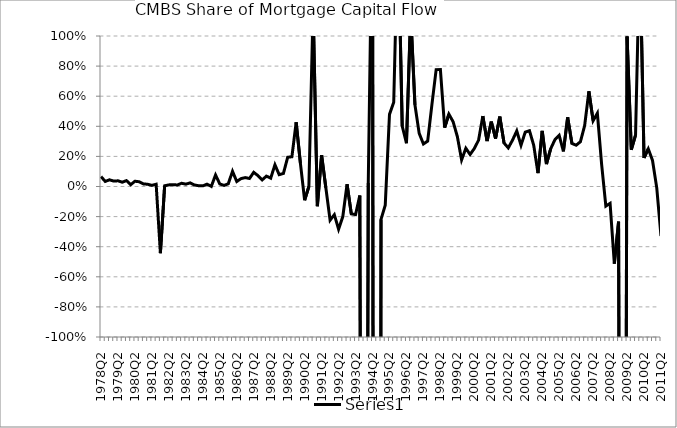
| Category | Series 0 |
|---|---|
| 1978Q2 | 0.066 |
| 1978Q3 | 0.034 |
| 1978Q4 | 0.045 |
| 1979Q1 | 0.036 |
| 1979Q2 | 0.038 |
| 1979Q3 | 0.028 |
| 1979Q4 | 0.039 |
| 1980Q1 | 0.012 |
| 1980Q2 | 0.035 |
| 1980Q3 | 0.032 |
| 1980Q4 | 0.017 |
| 1981Q1 | 0.015 |
| 1981Q2 | 0.008 |
| 1981Q3 | 0.015 |
| 1981Q4 | -0.443 |
| 1982Q1 | 0.005 |
| 1982Q2 | 0.011 |
| 1982Q3 | 0.012 |
| 1982Q4 | 0.01 |
| 1983Q1 | 0.022 |
| 1983Q2 | 0.015 |
| 1983Q3 | 0.024 |
| 1983Q4 | 0.01 |
| 1984Q1 | 0.005 |
| 1984Q2 | 0.004 |
| 1984Q3 | 0.016 |
| 1984Q4 | 0.001 |
| 1985Q1 | 0.076 |
| 1985Q2 | 0.017 |
| 1985Q3 | 0.007 |
| 1985Q4 | 0.018 |
| 1986Q1 | 0.101 |
| 1986Q2 | 0.033 |
| 1986Q3 | 0.052 |
| 1986Q4 | 0.059 |
| 1987Q1 | 0.053 |
| 1987Q2 | 0.094 |
| 1987Q3 | 0.072 |
| 1987Q4 | 0.044 |
| 1988Q1 | 0.069 |
| 1988Q2 | 0.055 |
| 1988Q3 | 0.144 |
| 1988Q4 | 0.079 |
| 1989Q1 | 0.087 |
| 1989Q2 | 0.194 |
| 1989Q3 | 0.198 |
| 1989Q4 | 0.427 |
| 1990Q1 | 0.155 |
| 1990Q2 | -0.091 |
| 1990Q3 | 0 |
| 1990Q4 | 1.188 |
| 1991Q1 | -0.131 |
| 1991Q2 | 0.208 |
| 1991Q3 | -0.008 |
| 1991Q4 | -0.224 |
| 1992Q1 | -0.187 |
| 1992Q2 | -0.284 |
| 1992Q3 | -0.2 |
| 1992Q4 | 0.015 |
| 1993Q1 | -0.182 |
| 1993Q2 | -0.187 |
| 1993Q3 | -0.06 |
| 1993Q4 | -9.414 |
| 1994Q1 | 0.024 |
| 1994Q2 | 1.984 |
| 1994Q3 | -24.911 |
| 1994Q4 | -0.219 |
| 1995Q1 | -0.125 |
| 1995Q2 | 0.479 |
| 1995Q3 | 0.559 |
| 1995Q4 | 1.724 |
| 1996Q1 | 0.401 |
| 1996Q2 | 0.288 |
| 1996Q3 | 1.153 |
| 1996Q4 | 0.543 |
| 1997Q1 | 0.353 |
| 1997Q2 | 0.282 |
| 1997Q3 | 0.302 |
| 1997Q4 | 0.544 |
| 1998Q1 | 0.777 |
| 1998Q2 | 0.777 |
| 1998Q3 | 0.391 |
| 1998Q4 | 0.481 |
| 1999Q1 | 0.43 |
| 1999Q2 | 0.331 |
| 1999Q3 | 0.177 |
| 1999Q4 | 0.254 |
| 2000Q1 | 0.213 |
| 2000Q2 | 0.253 |
| 2000Q3 | 0.308 |
| 2000Q4 | 0.468 |
| 2001Q1 | 0.302 |
| 2001Q2 | 0.431 |
| 2001Q3 | 0.319 |
| 2001Q4 | 0.465 |
| 2002Q1 | 0.289 |
| 2002Q2 | 0.256 |
| 2002Q3 | 0.308 |
| 2002Q4 | 0.369 |
| 2003Q1 | 0.274 |
| 2003Q2 | 0.361 |
| 2003Q3 | 0.37 |
| 2003Q4 | 0.274 |
| 2004Q1 | 0.089 |
| 2004Q2 | 0.37 |
| 2004Q3 | 0.149 |
| 2004Q4 | 0.251 |
| 2005Q1 | 0.311 |
| 2005Q2 | 0.339 |
| 2005Q3 | 0.233 |
| 2005Q4 | 0.459 |
| 2006Q1 | 0.286 |
| 2006Q2 | 0.274 |
| 2006Q3 | 0.297 |
| 2006Q4 | 0.404 |
| 2007Q1 | 0.632 |
| 2007Q2 | 0.438 |
| 2007Q3 | 0.487 |
| 2007Q4 | 0.149 |
| 2008Q1 | -0.13 |
| 2008Q2 | -0.112 |
| 2008Q3 | -0.513 |
| 2008Q4 | -0.234 |
| 2009Q1 | -10.123 |
| 2009Q2 | 0.997 |
| 2009Q3 | 0.244 |
| 2009Q4 | 0.342 |
| 2010Q1 | 1.578 |
| 2010Q2 | 0.189 |
| 2010Q3 | 0.25 |
| 2010Q4 | 0.173 |
| 2011Q1 | -0.009 |
| 2011Q2 | -0.329 |